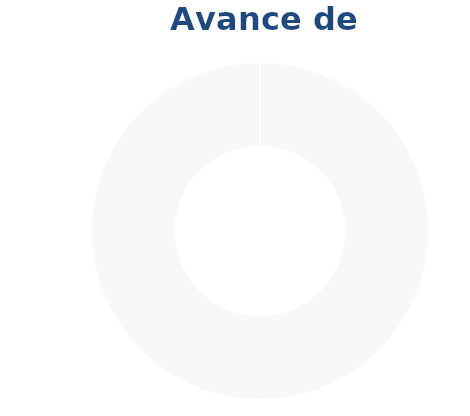
| Category | Series 0 |
|---|---|
| Acumulado 1 Trimestre | 0 |
| Año | -1 |